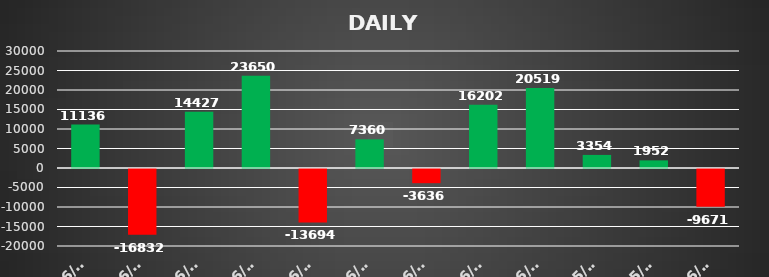
| Category | Series 0 |
|---|---|
| 2021-06-01 | 11136.431 |
| 2021-06-02 | -16831.98 |
| 2021-06-03 | 14426.808 |
| 2021-06-04 | 23650.098 |
| 2021-06-10 | -13693.55 |
| 2021-06-11 | 7360.32 |
| 2021-06-15 | -3635.6 |
| 2021-06-17 | 16202.4 |
| 2021-06-21 | 20518.85 |
| 2021-05-24 | 3354.18 |
| 2021-05-25 | 1951.515 |
| 2021-06-28 | -9670.635 |